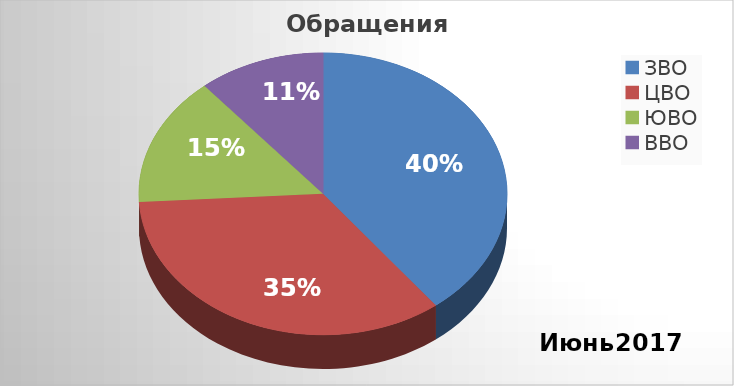
| Category | Series 0 |
|---|---|
| ЗВО | 32 |
| ЦВО | 28 |
| ЮВО | 12 |
| ВВО | 9 |